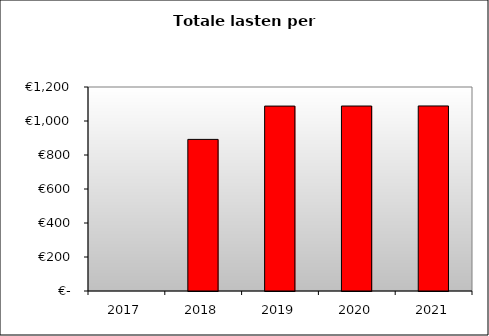
| Category | Series 0 |
|---|---|
| 2017.0 | 0 |
| 2018.0 | 891.813 |
| 2019.0 | 1087.743 |
| 2020.0 | 1088.102 |
| 2021.0 | 1088.489 |